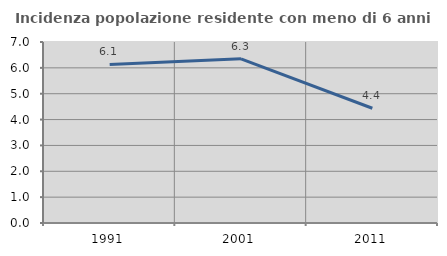
| Category | Incidenza popolazione residente con meno di 6 anni |
|---|---|
| 1991.0 | 6.132 |
| 2001.0 | 6.349 |
| 2011.0 | 4.438 |